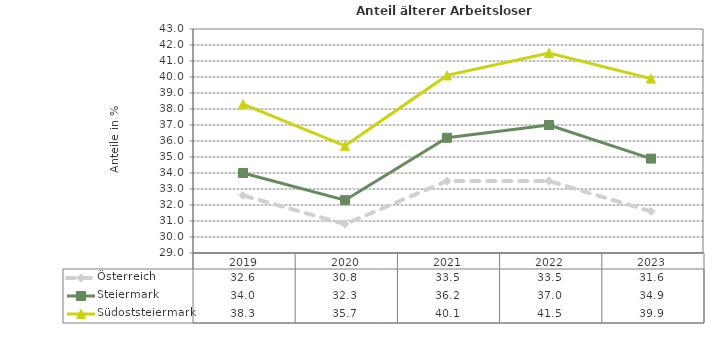
| Category | Österreich | Steiermark | Südoststeiermark |
|---|---|---|---|
| 2023.0 | 31.6 | 34.9 | 39.9 |
| 2022.0 | 33.5 | 37 | 41.5 |
| 2021.0 | 33.5 | 36.2 | 40.1 |
| 2020.0 | 30.8 | 32.3 | 35.7 |
| 2019.0 | 32.6 | 34 | 38.3 |